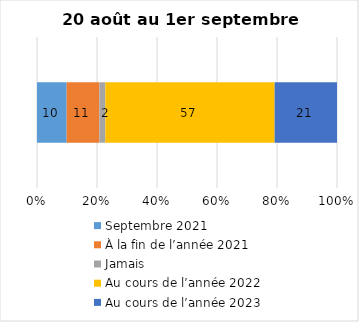
| Category | Septembre 2021 | À la fin de l’année 2021 | Jamais | Au cours de l’année 2022 | Au cours de l’année 2023 |
|---|---|---|---|---|---|
| 0 | 10 | 11 | 2 | 57 | 21 |